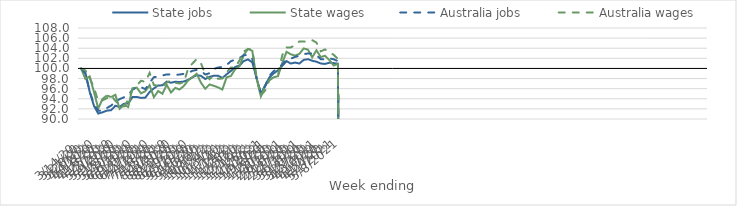
| Category | State jobs | State wages | Australia jobs | Australia wages |
|---|---|---|---|---|
| 14/03/2020 | 100 | 100 | 100 | 100 |
| 21/03/2020 | 99.132 | 97.909 | 98.971 | 99.603 |
| 28/03/2020 | 95.372 | 98.432 | 95.467 | 98.105 |
| 04/04/2020 | 92.59 | 95.328 | 92.92 | 96.234 |
| 11/04/2020 | 91.076 | 92.08 | 91.647 | 93.487 |
| 18/04/2020 | 91.326 | 93.962 | 91.63 | 93.692 |
| 25/04/2020 | 91.652 | 94.648 | 92.16 | 94.108 |
| 02/05/2020 | 91.737 | 94.338 | 92.657 | 94.655 |
| 09/05/2020 | 92.615 | 94.79 | 93.343 | 93.578 |
| 16/05/2020 | 92.395 | 92.025 | 93.935 | 92.812 |
| 23/05/2020 | 93.022 | 92.772 | 94.291 | 92.462 |
| 30/05/2020 | 93.061 | 92.375 | 94.798 | 93.79 |
| 06/06/2020 | 94.354 | 96.079 | 95.781 | 95.926 |
| 13/06/2020 | 94.361 | 96.203 | 96.28 | 96.602 |
| 20/06/2020 | 94.168 | 95.068 | 96.296 | 97.58 |
| 27/06/2020 | 94.226 | 95.494 | 95.902 | 97.326 |
| 04/07/2020 | 95.343 | 96.681 | 97.157 | 99.113 |
| 11/07/2020 | 96.062 | 94.316 | 98.279 | 96.733 |
| 18/07/2020 | 96.633 | 95.536 | 98.382 | 96.561 |
| 25/07/2020 | 96.663 | 94.989 | 98.604 | 96.362 |
| 01/08/2020 | 97.394 | 96.766 | 98.826 | 97.197 |
| 08/08/2020 | 97.178 | 95.235 | 98.822 | 97.652 |
| 15/08/2020 | 97.365 | 96.153 | 98.73 | 97.16 |
| 22/08/2020 | 97.305 | 95.835 | 98.792 | 97.027 |
| 29/08/2020 | 97.413 | 96.53 | 98.928 | 97.246 |
| 05/09/2020 | 97.749 | 97.633 | 99.113 | 99.964 |
| 12/09/2020 | 98.234 | 98.259 | 99.531 | 100.967 |
| 19/09/2020 | 98.672 | 98.936 | 99.714 | 101.852 |
| 26/09/2020 | 98.539 | 97.193 | 99.52 | 101.02 |
| 03/10/2020 | 97.916 | 95.974 | 98.806 | 98.883 |
| 10/10/2020 | 98.336 | 96.834 | 99.055 | 97.873 |
| 17/10/2020 | 98.558 | 96.57 | 99.899 | 98.568 |
| 24/10/2020 | 98.566 | 96.255 | 100.18 | 97.964 |
| 31/10/2020 | 98.11 | 95.828 | 100.306 | 97.998 |
| 07/11/2020 | 98.844 | 98.252 | 100.68 | 99.252 |
| 14/11/2020 | 99.504 | 98.502 | 101.424 | 100.173 |
| 21/11/2020 | 100.283 | 99.856 | 101.745 | 100.229 |
| 28/11/2020 | 100.598 | 100.419 | 102.059 | 101.576 |
| 05/12/2020 | 101.456 | 102.665 | 102.608 | 103.362 |
| 12/12/2020 | 101.782 | 103.882 | 102.679 | 103.837 |
| 19/12/2020 | 101.208 | 103.485 | 101.871 | 103.708 |
| 26/12/2020 | 98.135 | 97.997 | 98.073 | 98.239 |
| 02/01/2021 | 95.004 | 94.479 | 95.142 | 94.651 |
| 09/01/2021 | 96.665 | 96.552 | 96.464 | 95.644 |
| 16/01/2021 | 98.217 | 97.711 | 98.546 | 97.678 |
| 23/01/2021 | 99.033 | 98.258 | 99.493 | 98.293 |
| 30/01/2021 | 99.615 | 98.465 | 99.995 | 98.662 |
| 06/02/2021 | 100.515 | 101.064 | 100.749 | 102.61 |
| 13/02/2021 | 101.447 | 103.292 | 101.78 | 104.166 |
| 20/02/2021 | 100.966 | 102.796 | 101.937 | 104.163 |
| 27/02/2021 | 101.163 | 102.548 | 102.282 | 104.593 |
| 06/03/2021 | 100.974 | 102.871 | 102.496 | 105.335 |
| 13/03/2021 | 101.686 | 103.959 | 102.825 | 105.317 |
| 20/03/2021 | 101.835 | 103.716 | 102.964 | 105.281 |
| 27/03/2021 | 101.531 | 102.209 | 102.951 | 105.588 |
| 03/04/2021 | 101.331 | 103.594 | 102.614 | 105.117 |
| 10/04/2021 | 100.976 | 102.25 | 101.84 | 103.377 |
| 17/04/2021 | 100.894 | 102.509 | 101.797 | 103.762 |
| 24/04/2021 | 101.133 | 101.674 | 102 | 103.175 |
| 01/05/2021 | 101.056 | 100.594 | 101.825 | 102.713 |
| 08/05/2021 | 100.938 | 100.882 | 101.453 | 101.885 |